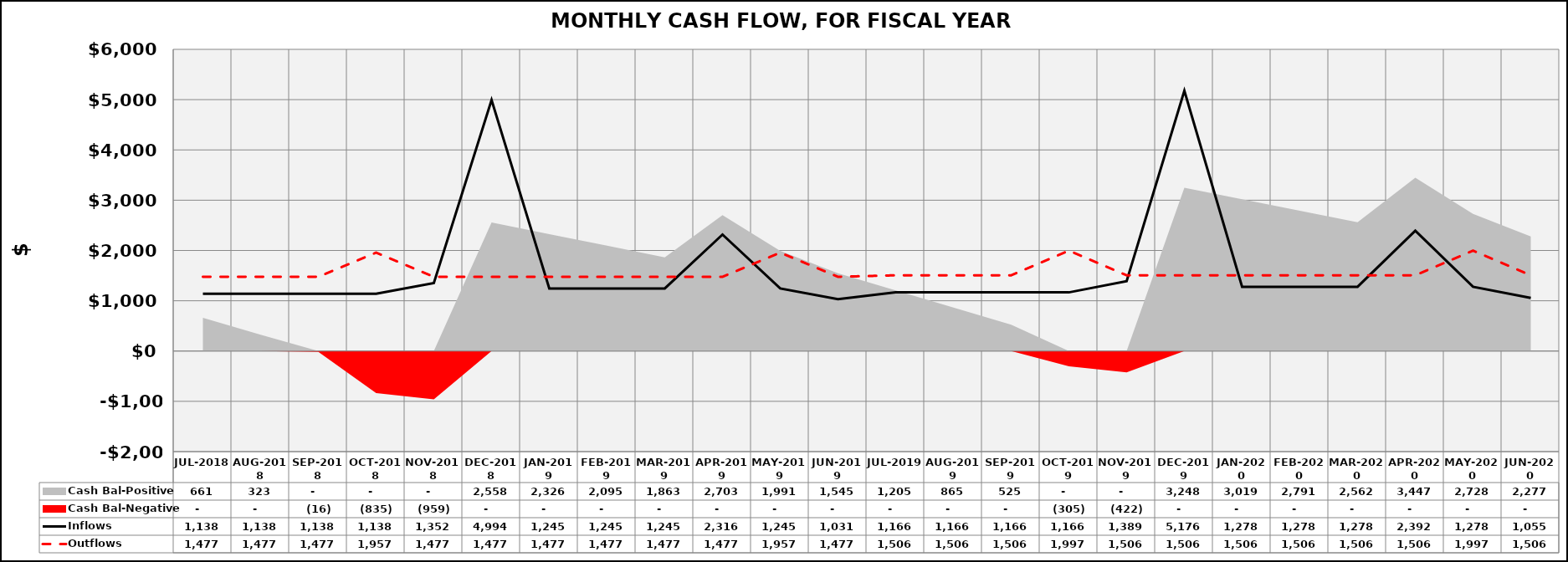
| Category | Inflows | Outflows |
|---|---|---|
| JUL-2018 | 1137.983 | 1476.538 |
| AUG-2018 | 1137.983 | 1476.538 |
| SEP-2018 | 1137.983 | 1476.538 |
| OCT-2018 | 1137.983 | 1957.308 |
| NOV-2018 | 1352.183 | 1476.538 |
| DEC-2018 | 4993.583 | 1476.538 |
| JAN-2019 | 1245.083 | 1476.538 |
| FEB-2019 | 1245.083 | 1476.538 |
| MAR-2019 | 1245.083 | 1476.538 |
| APR-2019 | 2316.083 | 1476.538 |
| MAY-2019 | 1245.083 | 1957.308 |
| JUN-2019 | 1030.883 | 1476.538 |
| JUL-2019 | 1166.342 | 1506.248 |
| AUG-2019 | 1166.342 | 1506.248 |
| SEP-2019 | 1166.342 | 1506.248 |
| OCT-2019 | 1166.342 | 1996.711 |
| NOV-2019 | 1389.11 | 1506.248 |
| DEC-2019 | 5176.166 | 1506.248 |
| JAN-2020 | 1277.726 | 1506.248 |
| FEB-2020 | 1277.726 | 1506.248 |
| MAR-2020 | 1277.726 | 1506.248 |
| APR-2020 | 2391.566 | 1506.248 |
| MAY-2020 | 1277.726 | 1996.711 |
| JUN-2020 | 1054.958 | 1506.248 |